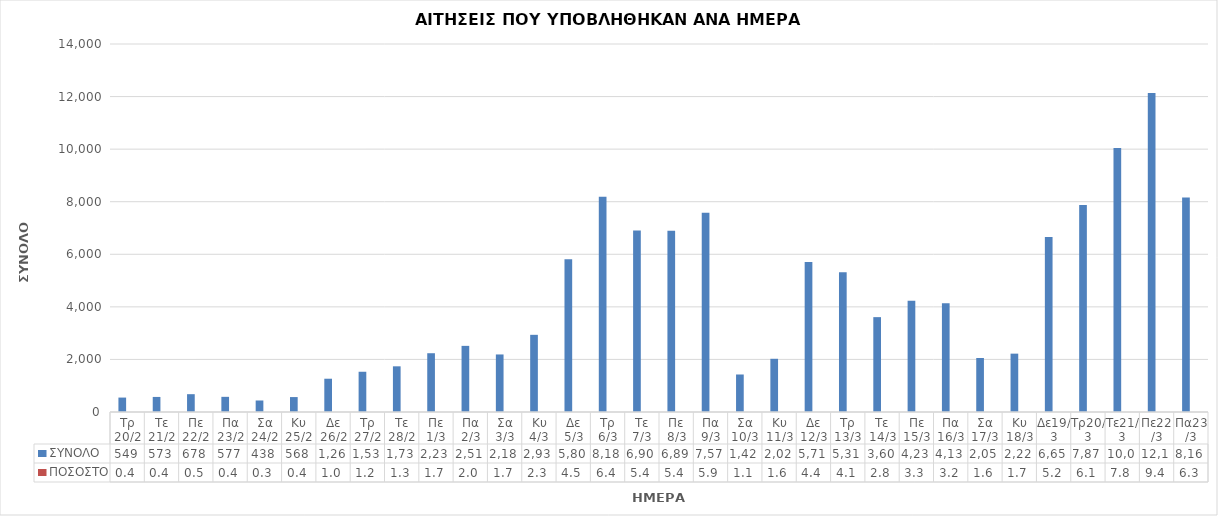
| Category | ΣΥΝΟΛΟ | ΠΟΣΟΣΤΟ |
|---|---|---|
| Τρ 20/2 | 549 | 0.004 |
| Τε 21/2 | 573 | 0.004 |
| Πε 22/2 | 678 | 0.005 |
| Πα 23/2 | 577 | 0.004 |
| Σα 24/2 | 438 | 0.003 |
| Κυ 25/2 | 568 | 0.004 |
| Δε 26/2 | 1266 | 0.01 |
| Τρ 27/2 | 1531 | 0.012 |
| Τε 28/2 | 1738 | 0.013 |
| Πε 1/3 | 2236 | 0.017 |
| Πα 2/3 | 2516 | 0.02 |
| Σα 3/3 | 2189 | 0.017 |
| Κυ 4/3 | 2936 | 0.023 |
| Δε 5/3 | 5808 | 0.045 |
| Τρ 6/3 | 8189 | 0.064 |
| Τε 7/3 | 6905 | 0.054 |
| Πε 8/3 | 6898 | 0.054 |
| Πα 9/3 | 7578 | 0.059 |
| Σα 10/3 | 1427 | 0.011 |
| Κυ 11/3 | 2024 | 0.016 |
| Δε 12/3 | 5711 | 0.044 |
| Τρ 13/3 | 5312 | 0.041 |
| Τε 14/3 | 3609 | 0.028 |
| Πε 15/3 | 4230 | 0.033 |
| Πα 16/3 | 4139 | 0.032 |
| Σα 17/3 | 2055 | 0.016 |
| Κυ 18/3 | 2220 | 0.017 |
| Δε19/3 | 6656 | 0.052 |
| Τρ20/3 | 7877 | 0.061 |
| Τε21/3 | 10045 | 0.078 |
| Πε22/3 | 12136 | 0.094 |
| Πα23/3 | 8160 | 0.063 |